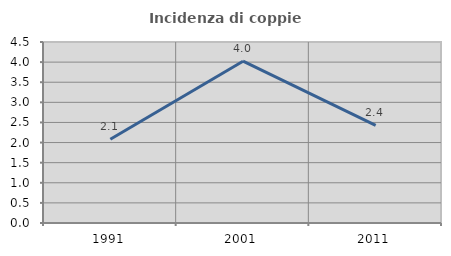
| Category | Incidenza di coppie miste |
|---|---|
| 1991.0 | 2.083 |
| 2001.0 | 4.023 |
| 2011.0 | 2.427 |